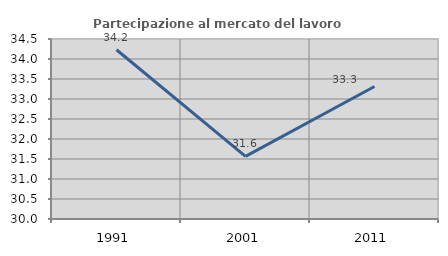
| Category | Partecipazione al mercato del lavoro  femminile |
|---|---|
| 1991.0 | 34.232 |
| 2001.0 | 31.564 |
| 2011.0 | 33.313 |